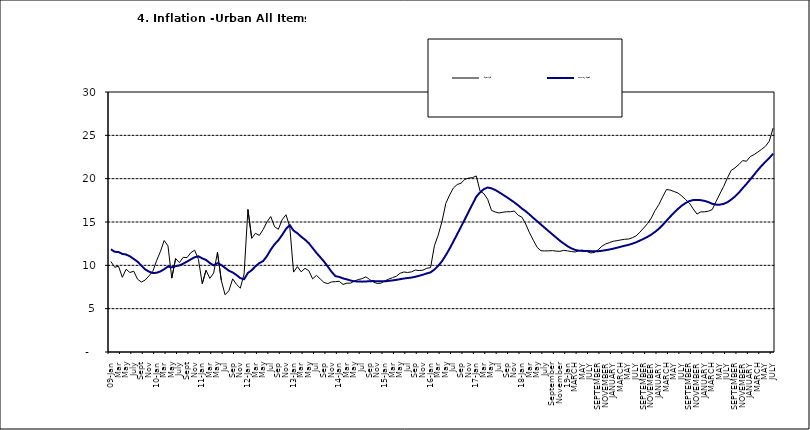
| Category | Year-on Rate | 12-Month Average |
|---|---|---|
| 09-Jan | 10.439 | 11.844 |
| Feb | 9.772 | 11.562 |
| Mar | 9.907 | 11.538 |
| Apr | 8.618 | 11.319 |
| May | 9.547 | 11.246 |
| June | 9.17 | 11.039 |
| July | 9.325 | 10.738 |
| Aug | 8.401 | 10.424 |
| Sept | 8.07 | 9.973 |
| Oct | 8.3 | 9.535 |
| Nov | 8.781 | 9.278 |
| Dec | 9.298 | 9.117 |
| 10-Jan | 10.534 | 9.136 |
| Feb | 11.584 | 9.297 |
| Mar | 12.864 | 9.555 |
| Apr | 12.24 | 9.859 |
| May | 8.524 | 9.769 |
| June | 10.781 | 9.904 |
| July | 10.313 | 9.987 |
| Aug | 10.924 | 10.197 |
| Sept | 10.891 | 10.43 |
| Oct | 11.457 | 10.689 |
| Nov | 11.748 | 10.932 |
| Dec | 10.699 | 11.042 |
| 11-Jan | 7.878 | 10.806 |
| Feb | 9.426 | 10.623 |
| Mar | 8.498 | 10.26 |
| Apr | 9.11 | 10.005 |
| May | 11.5 | 10.249 |
| Jun | 8.278 | 10.034 |
| Jul | 6.608 | 9.711 |
| Aug | 7.061 | 9.38 |
| Sep | 8.443 | 9.178 |
| Oct | 7.802 | 8.88 |
| Nov | 7.365 | 8.525 |
| Dec | 8.993 | 8.395 |
| 12-Jan | 16.445 | 9.119 |
| Feb | 13.123 | 9.443 |
| Mar | 13.701 | 9.889 |
| Apr | 13.447 | 10.259 |
| May | 14.127 | 10.496 |
| Jun | 15.012 | 11.062 |
| Jul | 15.63 | 11.81 |
| Aug | 14.456 | 12.422 |
| Sep | 14.162 | 12.893 |
| Oct | 15.26 | 13.506 |
| Nov | 15.836 | 14.199 |
| Dec | 14.459 | 14.637 |
| 13-Jan | 9.22 | 14.006 |
| Feb | 9.85 | 13.703 |
| Mar | 9.253 | 13.302 |
| Apr | 9.657 | 12.966 |
| May | 9.385 | 12.557 |
| Jun | 8.441 | 11.999 |
| Jul | 8.849 | 11.443 |
| Aug | 8.431 | 10.946 |
| Sep | 8.013 | 10.44 |
| Oct | 7.9 | 9.849 |
| Nov | 8.086 | 9.245 |
| Dec | 8.117 | 8.75 |
| 14-Jan | 8.164 | 8.662 |
| Feb | 7.791 | 8.493 |
| Mar | 7.937 | 8.384 |
| Apr | 7.947 | 8.246 |
| May | 8.195 | 8.151 |
| Jun | 8.358 | 8.146 |
| Jul | 8.464 | 8.118 |
| Aug | 8.673 | 8.141 |
| Sep | 8.357 | 8.17 |
| Oct | 8.064 | 8.182 |
| Nov | 7.902 | 8.165 |
| Dec | 7.948 | 8.151 |
| 15-Jan | 8.211 | 8.155 |
| Feb | 8.412 | 8.206 |
| Mar | 8.579 | 8.26 |
| Apr | 8.742 | 8.326 |
| May | 9.092 | 8.403 |
| Jun | 9.232 | 8.478 |
| Jul | 9.177 | 8.54 |
| Aug | 9.25 | 8.591 |
| Sep | 9.455 | 8.684 |
| Oct | 9.398 | 8.795 |
| Nov | 9.442 | 8.922 |
| Dec | 9.665 | 9.064 |
| 16-Jan | 9.728 | 9.19 |
| Feb | 12.254 | 9.516 |
| Mar | 13.485 | 9.935 |
| Apr | 15.052 | 10.474 |
| May | 17.148 | 11.165 |
| Jun | 18.111 | 11.925 |
| Jul | 18.927 | 12.754 |
| Aug | 19.325 | 13.605 |
| Sep | 19.476 | 14.444 |
| Oct | 19.914 | 15.318 |
| Nov | 20.067 | 16.193 |
| Dec | 20.118 | 17.05 |
| 17-Jan | 20.315 | 17.914 |
| Feb | 18.569 | 18.418 |
| Mar | 18.27 | 18.794 |
| Apr | 17.621 | 18.982 |
| May | 16.343 | 18.883 |
| Jun | 16.153 | 18.692 |
| Jul | 16.038 | 18.43 |
| Aug | 16.128 | 18.151 |
| Sep | 16.183 | 17.872 |
| Oct | 16.187 | 17.567 |
| Nov | 16.267 | 17.264 |
| Dec | 15.785 | 16.921 |
| 18-Jan | 15.559 | 16.55 |
| Feb | 14.763 | 16.241 |
| Mar | 13.748 | 15.866 |
| Apr | 12.893 | 15.468 |
| May | 12.077 | 15.096 |
| June | 11.683 | 14.706 |
| July | 11.661 | 14.329 |
| August | 11.673 | 13.951 |
| September | 11.697 | 13.578 |
| October | 11.64 | 13.206 |
| November | 11.615 | 12.831 |
| December | 11.731 | 12.509 |
| 19-Jan | 11.664 | 12.203 |
| February | 11.592 | 11.954 |
| MARCH | 11.535 | 11.78 |
| APRIL | 11.696 | 11.686 |
| MAY | 11.756 | 11.662 |
| JUNE | 11.605 | 11.655 |
| JULY | 11.432 | 11.635 |
| AUGUST | 11.479 | 11.618 |
| SEPTEMBER | 11.776 | 11.626 |
| OCTOBER | 12.202 | 11.676 |
| NOVEMBER | 12.469 | 11.75 |
| DECEMBER | 12.617 | 11.827 |
| JANUARY | 12.779 | 11.923 |
| FEBRUARY | 12.847 | 12.03 |
| MARCH | 12.932 | 12.147 |
| APRIL | 13.008 | 12.258 |
| MAY | 13.033 | 12.365 |
| JUNE | 13.178 | 12.496 |
| JULY | 13.403 | 12.659 |
| AUGUST | 13.827 | 12.855 |
| SEPTEMBER | 14.306 | 13.068 |
| OCTOBER | 14.811 | 13.289 |
| NOVEMBER | 15.466 | 13.546 |
| DECEMBER | 16.327 | 13.864 |
| JANUARY | 17.03 | 14.228 |
| FEBRUARY | 17.918 | 14.66 |
| MARCH | 18.756 | 15.154 |
| APRIL | 18.675 | 15.63 |
| MAY | 18.514 | 16.086 |
| JUNE | 18.348 | 16.512 |
| JULY | 18.007 | 16.886 |
| AUGUST | 17.59 | 17.187 |
| SEPTEMBER | 17.187 | 17.411 |
| OCTOBER | 16.52 | 17.534 |
| NOVEMBER | 15.916 | 17.55 |
| DECEMBER | 16.165 | 17.519 |
| JANUARY | 16.171 | 17.435 |
| FEBRUARY | 16.253 | 17.292 |
| MARCH | 16.438 | 17.103 |
| APRIL | 17.347 | 17.005 |
| MAY | 18.24 | 17.002 |
| JUNE | 19.093 | 17.087 |
| JULY | 20.087 | 17.285 |
| AUGUST | 20.954 | 17.588 |
| SEPTEMBER | 21.251 | 17.944 |
| OCTOBER | 21.632 | 18.379 |
| NOVEMBER | 22.086 | 18.896 |
| DECEMBER | 22.011 | 19.382 |
| JANUARY | 22.548 | 19.912 |
| FEBRUARY | 22.782 | 20.451 |
| MARCH | 23.072 | 20.998 |
| APRIL | 23.392 | 21.496 |
| MAY | 23.736 | 21.949 |
| JUNE | 24.326 | 22.384 |
| JULY | 25.831 | 22.874 |